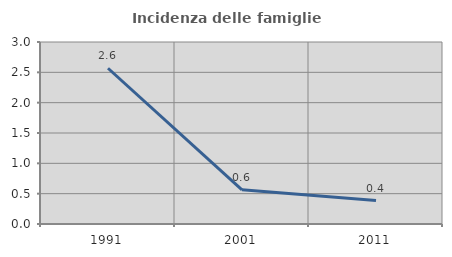
| Category | Incidenza delle famiglie numerose |
|---|---|
| 1991.0 | 2.567 |
| 2001.0 | 0.563 |
| 2011.0 | 0.386 |